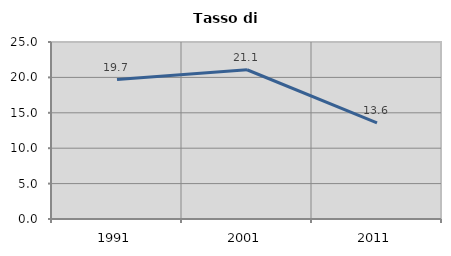
| Category | Tasso di disoccupazione   |
|---|---|
| 1991.0 | 19.7 |
| 2001.0 | 21.081 |
| 2011.0 | 13.591 |